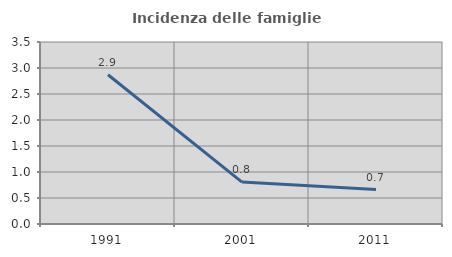
| Category | Incidenza delle famiglie numerose |
|---|---|
| 1991.0 | 2.871 |
| 2001.0 | 0.806 |
| 2011.0 | 0.661 |